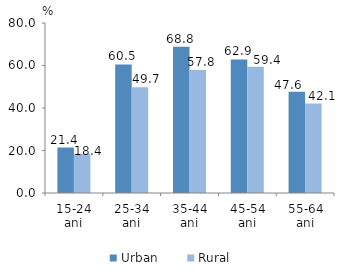
| Category | Urban | Rural |
|---|---|---|
| 15-24 ani | 21.404 | 18.433 |
| 25-34 ani | 60.504 | 49.706 |
| 35-44 ani | 68.833 | 57.826 |
| 45-54 ani | 62.865 | 59.38 |
| 55-64 ani | 47.589 | 42.079 |